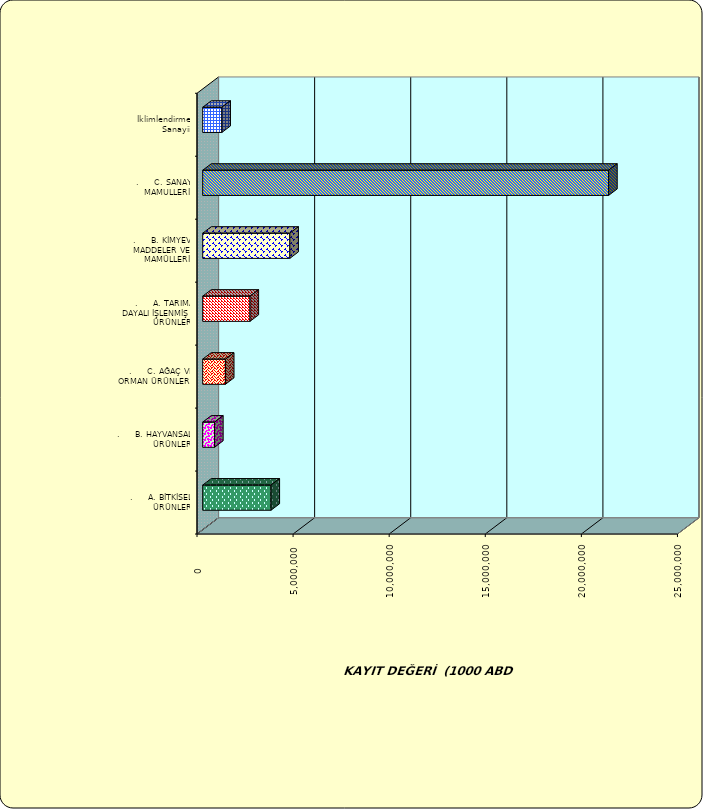
| Category | Series 0 |
|---|---|
| .     A. BİTKİSEL ÜRÜNLER | 3552646.75 |
| .     B. HAYVANSAL ÜRÜNLER | 617263.378 |
| .     C. AĞAÇ VE ORMAN ÜRÜNLERİ | 1181467.395 |
| .     A. TARIMA DAYALI İŞLENMİŞ ÜRÜNLER | 2461804.575 |
| .     B. KİMYEVİ MADDELER VE MAMÜLLERİ | 4533355.204 |
| .     C. SANAYİ MAMULLERİ | 21120982.179 |
|  İklimlendirme Sanayii | 997107 |